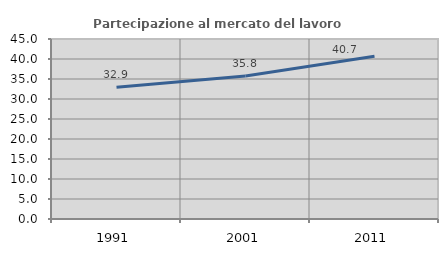
| Category | Partecipazione al mercato del lavoro  femminile |
|---|---|
| 1991.0 | 32.948 |
| 2001.0 | 35.775 |
| 2011.0 | 40.682 |